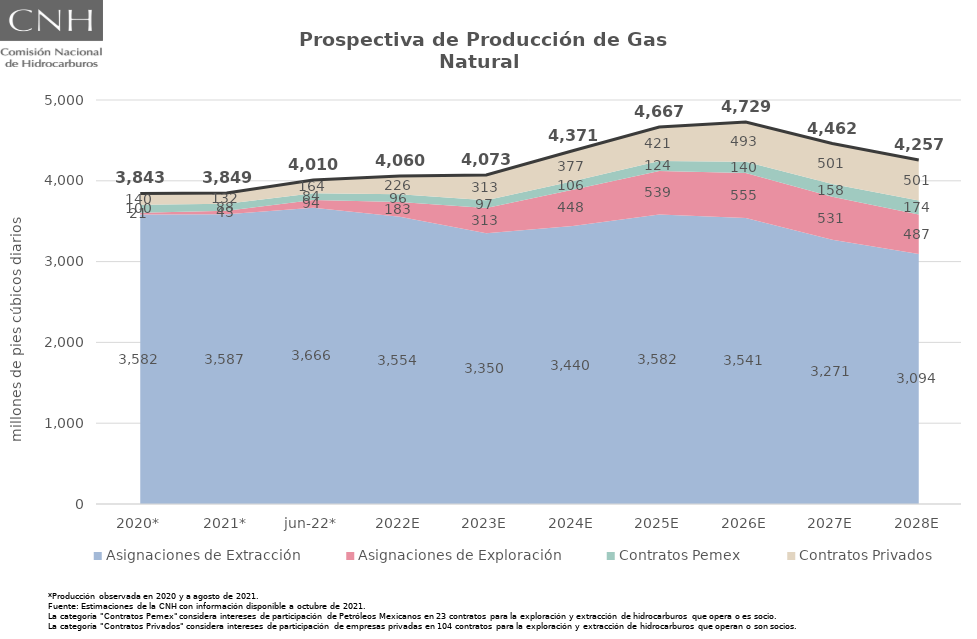
| Category | Total |
|---|---|
| 2020* | 3843.295 |
| 2021* | 3849.2 |
| jun-22* | 4009.858 |
| 2022E | 4059.517 |
| 2023E | 4072.67 |
| 2024E | 4371.261 |
| 2025E | 4666.682 |
| 2026E | 4728.504 |
| 2027E | 4461.611 |
| 2028E | 4256.501 |